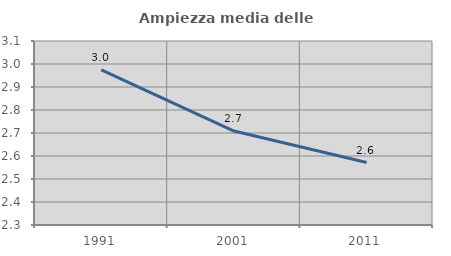
| Category | Ampiezza media delle famiglie |
|---|---|
| 1991.0 | 2.974 |
| 2001.0 | 2.709 |
| 2011.0 | 2.572 |